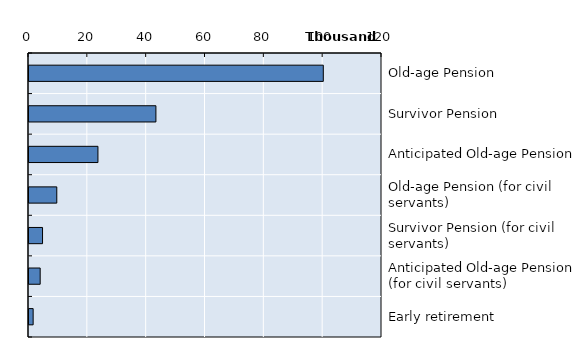
| Category | Series 0 |
|---|---|
| Old-age Pension | 100045 |
| Survivor Pension | 43141 |
| Anticipated Old-age Pension | 23439 |
| Old-age Pension (for civil servants) | 9446 |
| Survivor Pension (for civil servants) | 4605 |
| Anticipated Old-age Pension (for civil servants) | 3799 |
| Early retirement | 1410 |